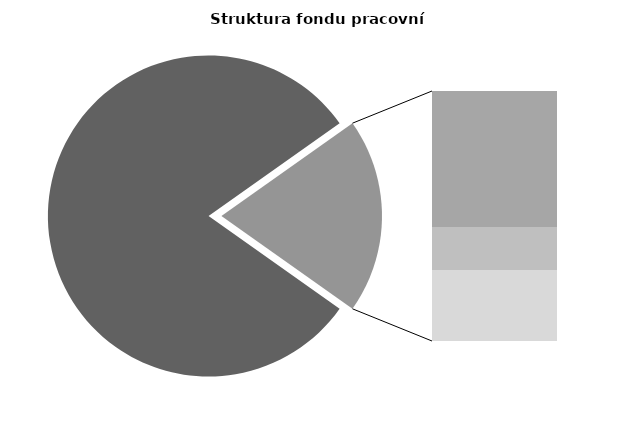
| Category | Series 0 |
|---|---|
| Průměrná měsíční odpracovaná doba bez přesčasu | 138.284 |
| Dovolená | 18.344 |
| Nemoc | 5.809 |
| Jiné | 9.59 |